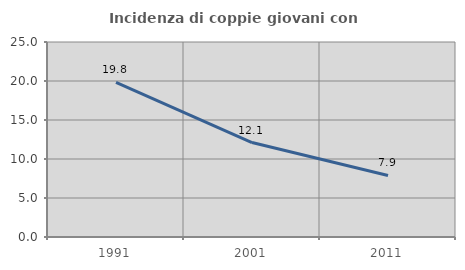
| Category | Incidenza di coppie giovani con figli |
|---|---|
| 1991.0 | 19.82 |
| 2001.0 | 12.109 |
| 2011.0 | 7.895 |